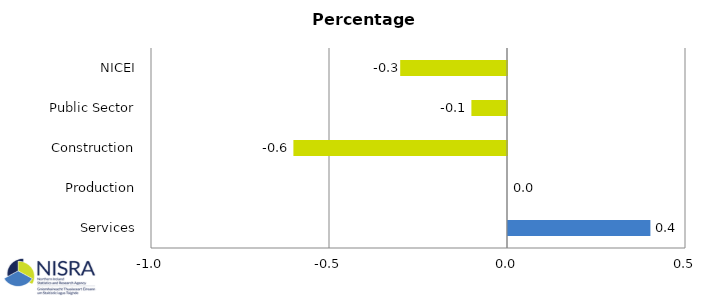
| Category | Percentage Points |
|---|---|
| Services | 0.4 |
| Production | 0 |
| Construction | -0.6 |
| Public Sector | -0.1 |
| NICEI | -0.3 |